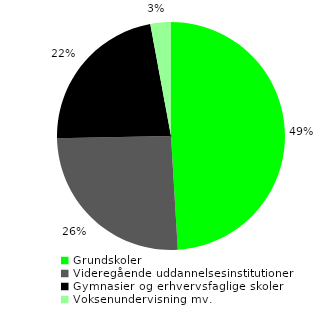
| Category | Series 0 |
|---|---|
| Grundskoler | 0.49 |
| Videregående uddannelsesinstitutioner | 0.256 |
| Gymnasier og erhvervsfaglige skoler | 0.224 |
| Voksenundervisning mv. | 0.029 |